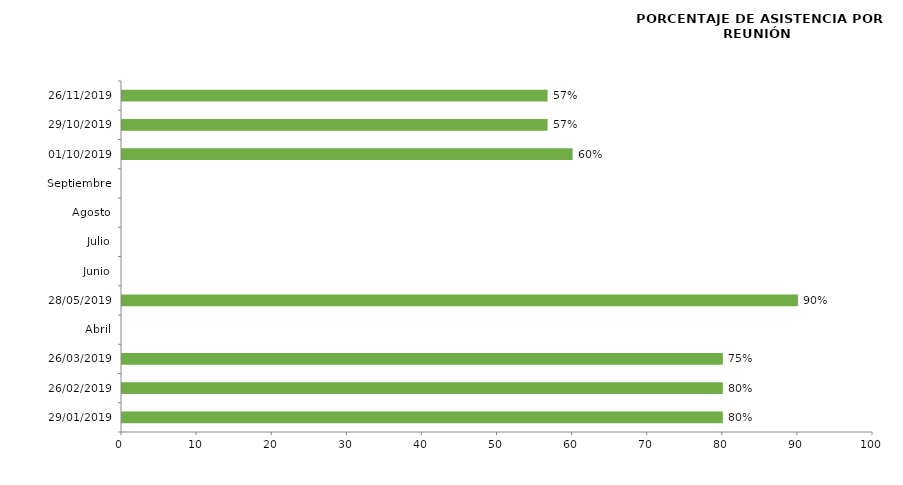
| Category | Series 0 |
|---|---|
| 29/01/2019 | 80 |
| 26/02/2019 | 80 |
| 26/03/2019 | 80 |
| Abril | 0 |
| 28/05/2019 | 90 |
| Junio | 0 |
| Julio | 0 |
| Agosto | 0 |
| Septiembre | 0 |
| 01/10/2019 | 60 |
| 29/10/2019 | 56.667 |
| 26/11/2019 | 56.667 |